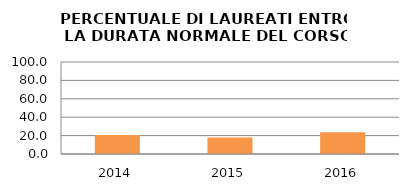
| Category | 2014 2015 2016 |
|---|---|
| 2014.0 | 20.732 |
| 2015.0 | 17.857 |
| 2016.0 | 23.711 |